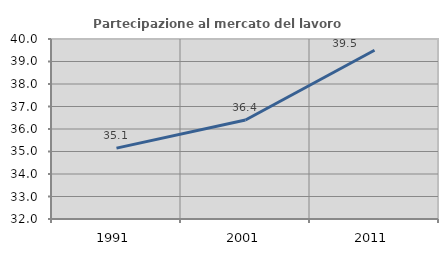
| Category | Partecipazione al mercato del lavoro  femminile |
|---|---|
| 1991.0 | 35.149 |
| 2001.0 | 36.398 |
| 2011.0 | 39.499 |